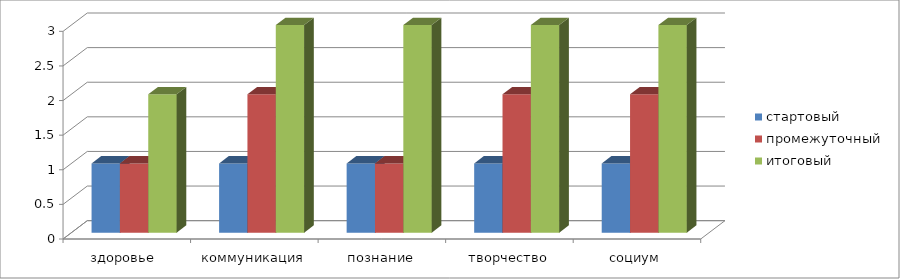
| Category | стартовый | промежуточный | итоговый |
|---|---|---|---|
| здоровье  | 1 | 1 | 2 |
| коммуникация | 1 | 2 | 3 |
| познание | 1 | 1 | 3 |
| творчество | 1 | 2 | 3 |
| социум | 1 | 2 | 3 |